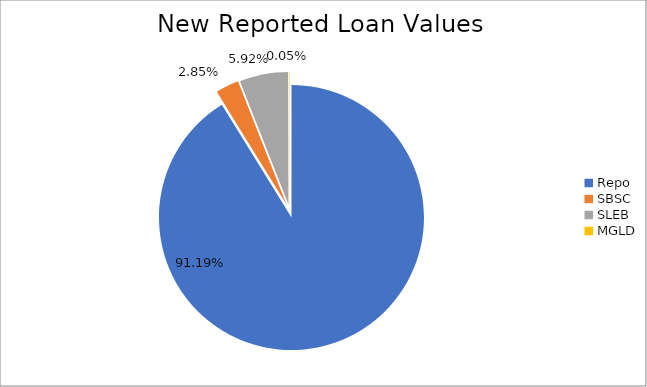
| Category | Series 0 |
|---|---|
| Repo | 8930764.799 |
| SBSC | 279064.912 |
| SLEB | 579513.703 |
| MGLD | 4715.863 |